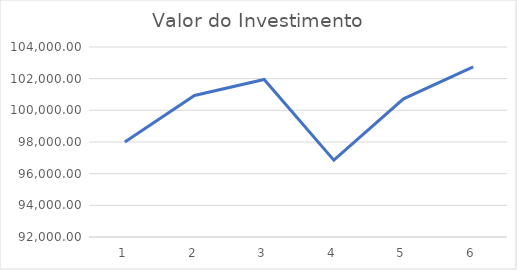
| Category | Valor do Investimento |
|---|---|
| 0 | 98000 |
| 1 | 100940 |
| 2 | 101949.4 |
| 3 | 96851.93 |
| 4 | 100726.007 |
| 5 | 102740.527 |